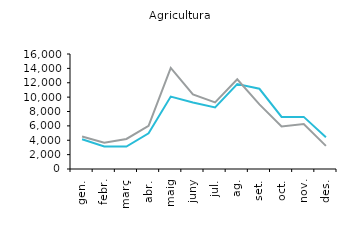
| Category | 2016 | 2017 |
|---|---|---|
| gen. | 4134 | 4525 |
| febr. | 3130 | 3662 |
| març | 3130 | 4180 |
| abr. | 4972 | 6004 |
| maig | 10075 | 14066 |
| juny | 9240 | 10389 |
| jul. | 8573 | 9272 |
| ag. | 11809 | 12474 |
| set. | 11164 | 8985 |
| oct. | 7240 | 5927 |
| nov. | 7251 | 6265 |
| des. | 4404 | 3216 |